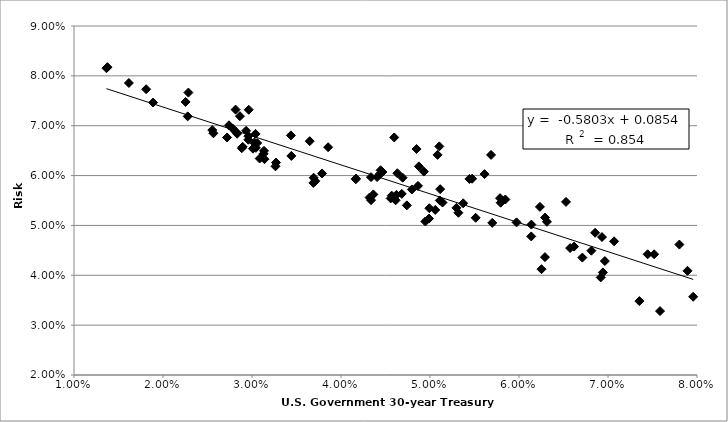
| Category | Series 0 |
|---|---|
| 0.07802062499999997 | 0.046 |
| 0.07893437499999999 | 0.041 |
| 0.07445446153846155 | 0.044 |
| 0.07518469696969694 | 0.044 |
| 0.07068396825396826 | 0.047 |
| 0.06855323076923074 | 0.049 |
| 0.06314272727272731 | 0.051 |
| 0.061389999999999986 | 0.05 |
| 0.06574515624999999 | 0.045 |
| 0.07352630769230767 | 0.035 |
| 0.07584772727272729 | 0.033 |
| 0.07956846153846153 | 0.036 |
| 0.06942584615384617 | 0.041 |
| 0.06711861538461537 | 0.044 |
| 0.06234815384615382 | 0.054 |
| 0.06292569230769232 | 0.052 |
| 0.06918323076923079 | 0.04 |
| 0.06964469696969697 | 0.043 |
| 0.06619 | 0.046 |
| 0.06813328125000001 | 0.045 |
| 0.06932415384615384 | 0.048 |
| 0.06528166666666667 | 0.055 |
| 0.06137227272727274 | 0.048 |
| 0.05846246153846155 | 0.055 |
| 0.05473196969696969 | 0.059 |
| 0.05104727272727275 | 0.066 |
| 0.05372968750000002 | 0.054 |
| 0.05794030769230768 | 0.055 |
| 0.06252848484848486 | 0.041 |
| 0.06291261538461539 | 0.044 |
| 0.059723230769230765 | 0.051 |
| 0.05787187500000002 | 0.055 |
| 0.05686107692307691 | 0.064 |
| 0.054425937500000014 | 0.059 |
| 0.05699338461538464 | 0.051 |
| 0.05297090909090909 | 0.054 |
| 0.0551321875 | 0.052 |
| 0.05612915384615385 | 0.06 |
| 0.0508485909090909 | 0.064 |
| 0.049307318181818195 | 0.061 |
| 0.048490953125 | 0.065 |
| 0.04597904615384617 | 0.068 |
| 0.051104863636363636 | 0.055 |
| 0.05114219696969698 | 0.057 |
| 0.048753138461538476 | 0.062 |
| 0.05319286153846153 | 0.053 |
| 0.05058801515151515 | 0.053 |
| 0.04864845454545455 | 0.058 |
| 0.046927312499999985 | 0.06 |
| 0.04465093846153847 | 0.061 |
| 0.044381742424242414 | 0.06 |
| 0.046829078125 | 0.056 |
| 0.04633183076923076 | 0.06 |
| 0.05140650769230769 | 0.055 |
| 0.0499256923076923 | 0.053 |
| 0.04739560000000001 | 0.054 |
| 0.047964107692307696 | 0.057 |
| 0.049891384615384615 | 0.051 |
| 0.04947043076923079 | 0.051 |
| 0.046137848484848476 | 0.055 |
| 0.044057984615384606 | 0.06 |
| 0.045697861538461525 | 0.056 |
| 0.04444857575757576 | 0.061 |
| 0.03648545454545455 | 0.067 |
| 0.034371828125000004 | 0.068 |
| 0.04167533846153845 | 0.059 |
| 0.043207924242424235 | 0.056 |
| 0.04336901515151515 | 0.06 |
| 0.04623328125000001 | 0.056 |
| 0.04363555384615385 | 0.056 |
| 0.03855463636363636 | 0.066 |
| 0.041662787878787896 | 0.059 |
| 0.04558379687499998 | 0.055 |
| 0.043380446153846154 | 0.055 |
| 0.03692825757575758 | 0.06 |
| 0.03039281538461539 | 0.068 |
| 0.03135133846153847 | 0.065 |
| 0.029340830769230764 | 0.069 |
| 0.02741293846153846 | 0.07 |
| 0.028642166666666666 | 0.072 |
| 0.031295609375 | 0.064 |
| 0.031398800000000004 | 0.063 |
| 0.0371136212121212 | 0.059 |
| 0.03787227272727271 | 0.06 |
| 0.03689290624999999 | 0.059 |
| 0.034420169230769224 | 0.064 |
| 0.032637651515151515 | 0.062 |
| 0.029634439393939404 | 0.073 |
| 0.025536187500000005 | 0.069 |
| 0.028846923076923076 | 0.065 |
| 0.029591227272727273 | 0.068 |
| 0.029592590909090898 | 0.067 |
| 0.0271972 | 0.068 |
| 0.025666046153846152 | 0.068 |
| 0.022773333333333333 | 0.072 |
| 0.028326507692307684 | 0.068 |
| 0.030435492307692304 | 0.066 |
| 0.02895535384615384 | 0.066 |
| 0.028157476923076918 | 0.073 |
| 0.028170630769230768 | 0.069 |
| 0.030233969230769233 | 0.067 |
| 0.030863630769230772 | 0.063 |
| 0.030584523076923074 | 0.067 |
| 0.03270189393939394 | 0.063 |
| 0.030102703124999998 | 0.065 |
| 0.027823599999999997 | 0.069 |
| 0.02285531818181818 | 0.077 |
| 0.02253839393939394 | 0.075 |
| 0.01888032307692307 | 0.075 |
| 0.013756846153846161 | 0.082 |
| 0.013650969696969693 | 0.082 |
| 0.016167287878787885 | 0.079 |
| 0.018108 | 0.077 |